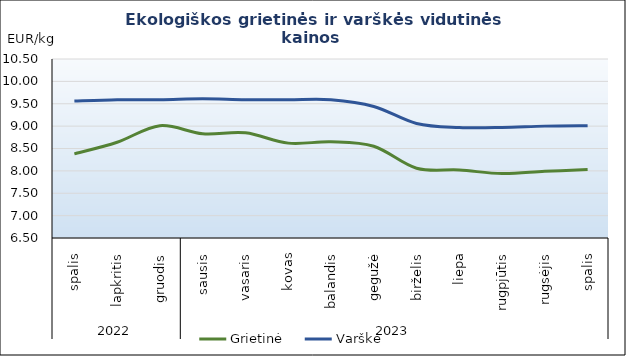
| Category | Grietinė | Varškė |
|---|---|---|
| 0 | 8.38 | 9.56 |
| 1 | 8.64 | 9.59 |
| 2 | 9.01 | 9.59 |
| 3 | 8.83 | 9.61 |
| 4 | 8.85 | 9.59 |
| 5 | 8.62 | 9.59 |
| 6 | 8.65 | 9.59 |
| 7 | 8.55 | 9.44 |
| 8 | 8.06 | 9.06 |
| 9 | 8.02 | 8.97 |
| 10 | 7.94 | 8.97 |
| 11 | 7.99 | 9 |
| 12 | 8.03 | 9.01 |